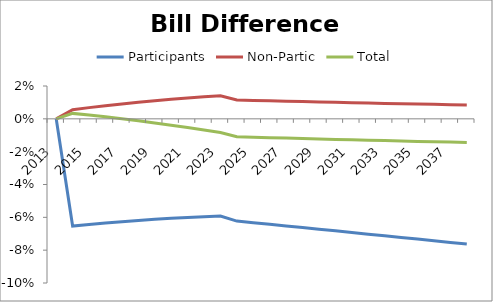
| Category | Participants | Non-Partic | Total |
|---|---|---|---|
| 2013.0 | 0 | 0 | 0 |
| 2014.0 | -0.065 | 0.006 | 0.003 |
| 2015.0 | -0.064 | 0.007 | 0.002 |
| 2016.0 | -0.063 | 0.008 | 0.001 |
| 2017.0 | -0.063 | 0.009 | 0 |
| 2018.0 | -0.062 | 0.01 | -0.001 |
| 2019.0 | -0.061 | 0.011 | -0.002 |
| 2020.0 | -0.061 | 0.012 | -0.004 |
| 2021.0 | -0.06 | 0.013 | -0.005 |
| 2022.0 | -0.06 | 0.013 | -0.007 |
| 2023.0 | -0.059 | 0.014 | -0.008 |
| 2024.0 | -0.062 | 0.011 | -0.011 |
| 2025.0 | -0.063 | 0.011 | -0.011 |
| 2026.0 | -0.064 | 0.011 | -0.011 |
| 2027.0 | -0.065 | 0.011 | -0.012 |
| 2028.0 | -0.066 | 0.011 | -0.012 |
| 2029.0 | -0.067 | 0.01 | -0.012 |
| 2030.0 | -0.068 | 0.01 | -0.013 |
| 2031.0 | -0.069 | 0.01 | -0.013 |
| 2032.0 | -0.07 | 0.01 | -0.013 |
| 2033.0 | -0.071 | 0.009 | -0.013 |
| 2034.0 | -0.072 | 0.009 | -0.014 |
| 2035.0 | -0.073 | 0.009 | -0.014 |
| 2036.0 | -0.074 | 0.009 | -0.014 |
| 2037.0 | -0.075 | 0.009 | -0.014 |
| 2038.0 | -0.076 | 0.008 | -0.014 |